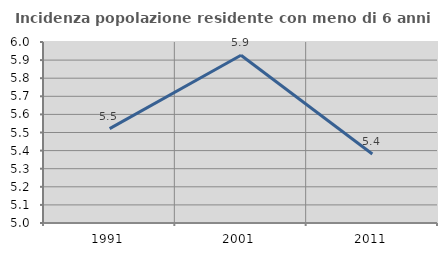
| Category | Incidenza popolazione residente con meno di 6 anni |
|---|---|
| 1991.0 | 5.521 |
| 2001.0 | 5.927 |
| 2011.0 | 5.381 |